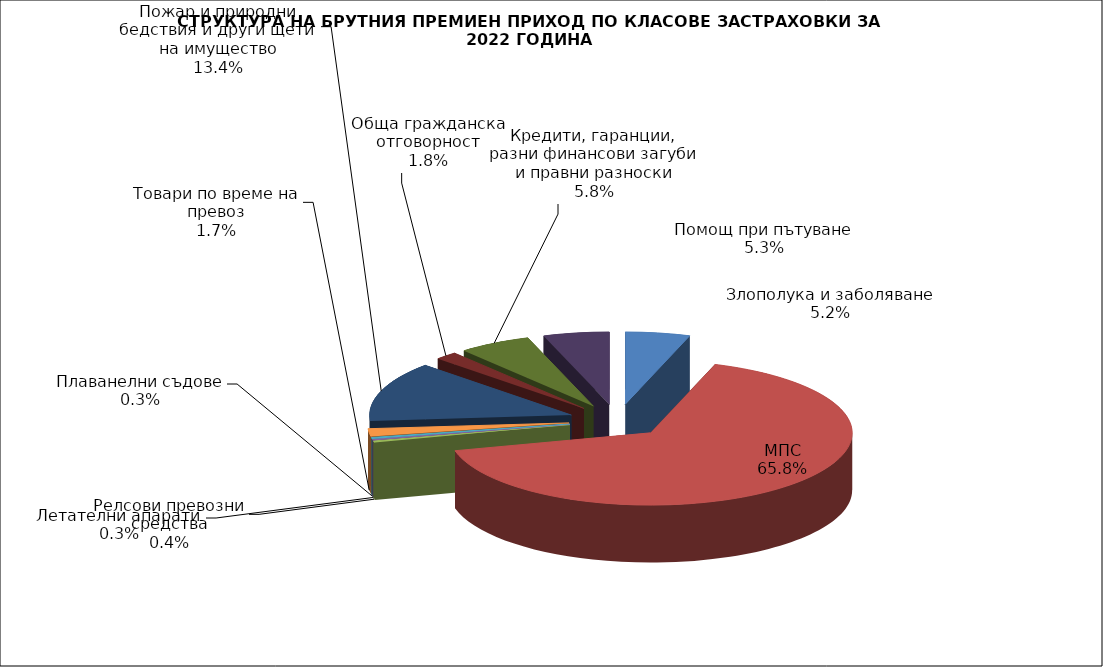
| Category | Злополука и заболяване |
|---|---|
| Злополука и заболяване | 0.052 |
| МПС | 0.658 |
| Релсови превозни средства | 0.004 |
| Летателни апарати | 0.003 |
| Плаванелни съдове | 0.003 |
| Товари по време на превоз | 0.017 |
| Пожар и природни бедствия и други щети на имущество | 0.134 |
| Обща гражданска отговорност | 0.018 |
| Кредити, гаранции, разни финансови загуби и правни разноски | 0.058 |
| Помощ при пътуване | 0.053 |